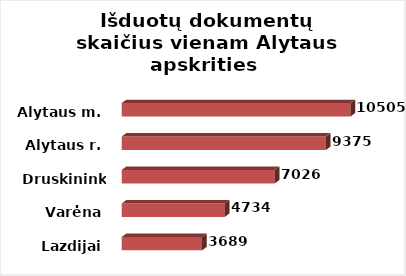
| Category | Series 0 |
|---|---|
| Lazdijai | 3689 |
| Varėna | 4733.614 |
| Druskininkai | 7026.474 |
| Alytaus r. | 9375 |
| Alytaus m. | 10504.962 |